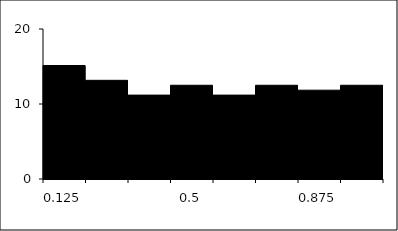
| Category | Series 1 |
|---|---|
| 0.125 | 15.132 |
| 0.25 | 13.158 |
| 0.375 | 11.184 |
| 0.5 | 12.5 |
| 0.625 | 11.184 |
| 0.75 | 12.5 |
| 0.875 | 11.842 |
| 1.0 | 12.5 |